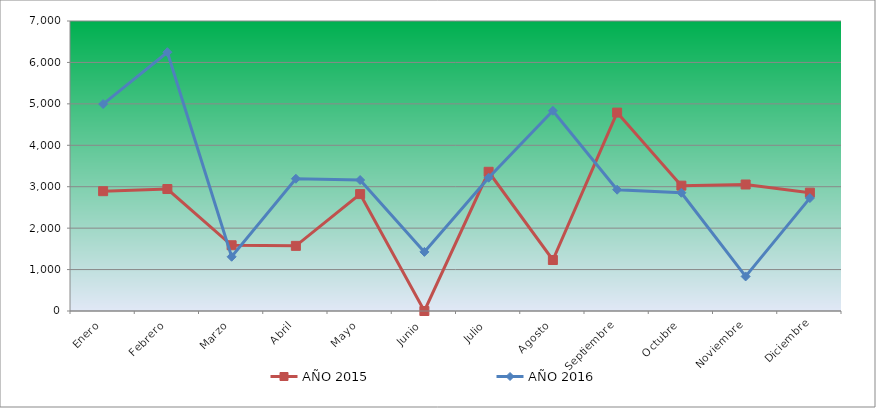
| Category | AÑO 2015 | AÑO 2016 |
|---|---|---|
| Enero | 2892.124 | 4994.356 |
| Febrero | 2944.299 | 6246.694 |
| Marzo | 1586.96 | 1309.35 |
| Abril | 1572.129 | 3192.459 |
| Mayo | 2821.675 | 3161.321 |
| Junio | 0 | 1427.044 |
| Julio | 3360.27 | 3216.922 |
| Agosto | 1231.007 | 4833.579 |
| Septiembre | 4789.426 | 2927.647 |
| Octubre | 3025.607 | 2854.088 |
| Noviembre | 3053.82 | 834.017 |
| Diciembre | 2856.689 | 2725.36 |